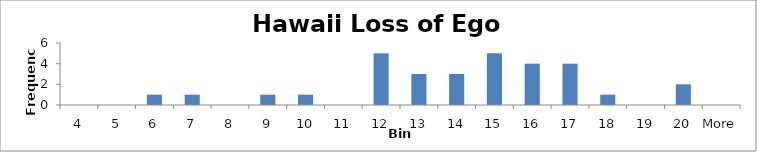
| Category | Frequency |
|---|---|
| 4 | 0 |
| 5 | 0 |
| 6 | 1 |
| 7 | 1 |
| 8 | 0 |
| 9 | 1 |
| 10 | 1 |
| 11 | 0 |
| 12 | 5 |
| 13 | 3 |
| 14 | 3 |
| 15 | 5 |
| 16 | 4 |
| 17 | 4 |
| 18 | 1 |
| 19 | 0 |
| 20 | 2 |
| More | 0 |